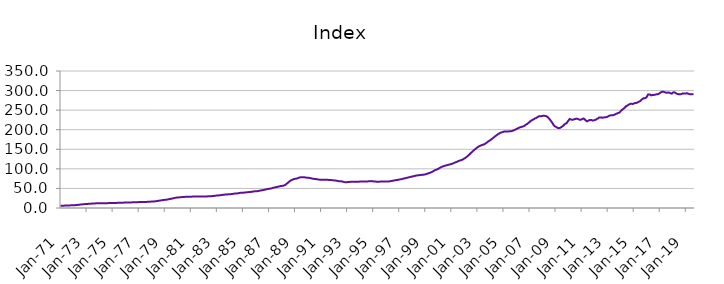
| Category | Index |
|---|---|
| 1971-01-01 | 5.879 |
| 1971-02-01 | 5.921 |
| 1971-03-01 | 5.963 |
| 1971-04-01 | 6.018 |
| 1971-05-01 | 6.108 |
| 1971-06-01 | 6.203 |
| 1971-07-01 | 6.32 |
| 1971-08-01 | 6.446 |
| 1971-09-01 | 6.572 |
| 1971-10-01 | 6.703 |
| 1971-11-01 | 6.844 |
| 1971-12-01 | 7.015 |
| 1972-01-01 | 7.135 |
| 1972-02-01 | 7.213 |
| 1972-03-01 | 7.39 |
| 1972-04-01 | 7.638 |
| 1972-05-01 | 7.997 |
| 1972-06-01 | 8.312 |
| 1972-07-01 | 8.674 |
| 1972-08-01 | 9.023 |
| 1972-09-01 | 9.332 |
| 1972-10-01 | 9.62 |
| 1972-11-01 | 9.887 |
| 1972-12-01 | 10.162 |
| 1973-01-01 | 10.359 |
| 1973-02-01 | 10.498 |
| 1973-03-01 | 10.658 |
| 1973-04-01 | 10.841 |
| 1973-05-01 | 11.075 |
| 1973-06-01 | 11.227 |
| 1973-07-01 | 11.386 |
| 1973-08-01 | 11.562 |
| 1973-09-01 | 11.768 |
| 1973-10-01 | 11.982 |
| 1973-11-01 | 12.145 |
| 1973-12-01 | 12.262 |
| 1974-01-01 | 12.324 |
| 1974-02-01 | 12.392 |
| 1974-03-01 | 12.389 |
| 1974-04-01 | 12.362 |
| 1974-05-01 | 12.339 |
| 1974-06-01 | 12.34 |
| 1974-07-01 | 12.352 |
| 1974-08-01 | 12.392 |
| 1974-09-01 | 12.465 |
| 1974-10-01 | 12.555 |
| 1974-11-01 | 12.63 |
| 1974-12-01 | 12.703 |
| 1975-01-01 | 12.737 |
| 1975-02-01 | 12.78 |
| 1975-03-01 | 12.857 |
| 1975-04-01 | 12.965 |
| 1975-05-01 | 13.097 |
| 1975-06-01 | 13.168 |
| 1975-07-01 | 13.237 |
| 1975-08-01 | 13.332 |
| 1975-09-01 | 13.462 |
| 1975-10-01 | 13.606 |
| 1975-11-01 | 13.732 |
| 1975-12-01 | 13.867 |
| 1976-01-01 | 13.963 |
| 1976-02-01 | 14.052 |
| 1976-03-01 | 14.114 |
| 1976-04-01 | 14.179 |
| 1976-05-01 | 14.264 |
| 1976-06-01 | 14.32 |
| 1976-07-01 | 14.382 |
| 1976-08-01 | 14.474 |
| 1976-09-01 | 14.605 |
| 1976-10-01 | 14.752 |
| 1976-11-01 | 14.87 |
| 1976-12-01 | 14.976 |
| 1977-01-01 | 15.034 |
| 1977-02-01 | 15.102 |
| 1977-03-01 | 15.145 |
| 1977-04-01 | 15.197 |
| 1977-05-01 | 15.276 |
| 1977-06-01 | 15.347 |
| 1977-07-01 | 15.436 |
| 1977-08-01 | 15.557 |
| 1977-09-01 | 15.705 |
| 1977-10-01 | 15.871 |
| 1977-11-01 | 16.048 |
| 1977-12-01 | 16.278 |
| 1978-01-01 | 16.449 |
| 1978-02-01 | 16.582 |
| 1978-03-01 | 16.762 |
| 1978-04-01 | 17.003 |
| 1978-05-01 | 17.391 |
| 1978-06-01 | 17.783 |
| 1978-07-01 | 18.258 |
| 1978-08-01 | 18.744 |
| 1978-09-01 | 19.213 |
| 1978-10-01 | 19.678 |
| 1978-11-01 | 20.113 |
| 1978-12-01 | 20.542 |
| 1979-01-01 | 20.797 |
| 1979-02-01 | 20.968 |
| 1979-03-01 | 21.394 |
| 1979-04-01 | 21.979 |
| 1979-05-01 | 22.725 |
| 1979-06-01 | 23.198 |
| 1979-07-01 | 23.69 |
| 1979-08-01 | 24.243 |
| 1979-09-01 | 24.906 |
| 1979-10-01 | 25.613 |
| 1979-11-01 | 26.202 |
| 1979-12-01 | 26.66 |
| 1980-01-01 | 26.911 |
| 1980-02-01 | 27.107 |
| 1980-03-01 | 27.357 |
| 1980-04-01 | 27.651 |
| 1980-05-01 | 27.994 |
| 1980-06-01 | 28.178 |
| 1980-07-01 | 28.344 |
| 1980-08-01 | 28.498 |
| 1980-09-01 | 28.607 |
| 1980-10-01 | 28.676 |
| 1980-11-01 | 28.73 |
| 1980-12-01 | 28.843 |
| 1981-01-01 | 28.911 |
| 1981-02-01 | 29.013 |
| 1981-03-01 | 29.116 |
| 1981-04-01 | 29.254 |
| 1981-05-01 | 29.394 |
| 1981-06-01 | 29.441 |
| 1981-07-01 | 29.464 |
| 1981-08-01 | 29.469 |
| 1981-09-01 | 29.414 |
| 1981-10-01 | 29.312 |
| 1981-11-01 | 29.219 |
| 1981-12-01 | 29.209 |
| 1982-01-01 | 29.164 |
| 1982-02-01 | 29.184 |
| 1982-03-01 | 29.346 |
| 1982-04-01 | 29.618 |
| 1982-05-01 | 29.924 |
| 1982-06-01 | 30.035 |
| 1982-07-01 | 30.119 |
| 1982-08-01 | 30.28 |
| 1982-09-01 | 30.54 |
| 1982-10-01 | 30.849 |
| 1982-11-01 | 31.157 |
| 1982-12-01 | 31.538 |
| 1983-01-01 | 31.828 |
| 1983-02-01 | 32.078 |
| 1983-03-01 | 32.337 |
| 1983-04-01 | 32.659 |
| 1983-05-01 | 33.081 |
| 1983-06-01 | 33.413 |
| 1983-07-01 | 33.773 |
| 1983-08-01 | 34.116 |
| 1983-09-01 | 34.39 |
| 1983-10-01 | 34.614 |
| 1983-11-01 | 34.826 |
| 1983-12-01 | 35.104 |
| 1984-01-01 | 35.27 |
| 1984-02-01 | 35.438 |
| 1984-03-01 | 35.758 |
| 1984-04-01 | 36.202 |
| 1984-05-01 | 36.71 |
| 1984-06-01 | 36.936 |
| 1984-07-01 | 37.124 |
| 1984-08-01 | 37.411 |
| 1984-09-01 | 37.87 |
| 1984-10-01 | 38.4 |
| 1984-11-01 | 38.81 |
| 1984-12-01 | 39.095 |
| 1985-01-01 | 39.174 |
| 1985-02-01 | 39.283 |
| 1985-03-01 | 39.552 |
| 1985-04-01 | 39.93 |
| 1985-05-01 | 40.361 |
| 1985-06-01 | 40.527 |
| 1985-07-01 | 40.681 |
| 1985-08-01 | 40.948 |
| 1985-09-01 | 41.393 |
| 1985-10-01 | 41.902 |
| 1985-11-01 | 42.329 |
| 1985-12-01 | 42.671 |
| 1986-01-01 | 42.803 |
| 1986-02-01 | 42.939 |
| 1986-03-01 | 43.335 |
| 1986-04-01 | 43.908 |
| 1986-05-01 | 44.624 |
| 1986-06-01 | 45.057 |
| 1986-07-01 | 45.499 |
| 1986-08-01 | 46.028 |
| 1986-09-01 | 46.692 |
| 1986-10-01 | 47.409 |
| 1986-11-01 | 48.06 |
| 1986-12-01 | 48.667 |
| 1987-01-01 | 49.02 |
| 1987-02-01 | 49.311 |
| 1987-03-01 | 49.944 |
| 1987-04-01 | 50.795 |
| 1987-05-01 | 51.813 |
| 1987-06-01 | 52.387 |
| 1987-07-01 | 52.937 |
| 1987-08-01 | 53.541 |
| 1987-09-01 | 54.197 |
| 1987-10-01 | 54.877 |
| 1987-11-01 | 55.513 |
| 1987-12-01 | 56.172 |
| 1988-01-01 | 56.486 |
| 1988-02-01 | 56.756 |
| 1988-03-01 | 57.701 |
| 1988-04-01 | 59.124 |
| 1988-05-01 | 61.264 |
| 1988-06-01 | 63.424 |
| 1988-07-01 | 65.968 |
| 1988-08-01 | 68.307 |
| 1988-09-01 | 70.109 |
| 1988-10-01 | 71.604 |
| 1988-11-01 | 72.807 |
| 1988-12-01 | 73.875 |
| 1989-01-01 | 74.434 |
| 1989-02-01 | 74.906 |
| 1989-03-01 | 75.707 |
| 1989-04-01 | 76.727 |
| 1989-05-01 | 77.807 |
| 1989-06-01 | 78.279 |
| 1989-07-01 | 78.601 |
| 1989-08-01 | 78.752 |
| 1989-09-01 | 78.622 |
| 1989-10-01 | 78.258 |
| 1989-11-01 | 77.774 |
| 1989-12-01 | 77.38 |
| 1990-01-01 | 77.025 |
| 1990-02-01 | 77.011 |
| 1990-03-01 | 76.482 |
| 1990-04-01 | 75.796 |
| 1990-05-01 | 74.994 |
| 1990-06-01 | 74.611 |
| 1990-07-01 | 74.285 |
| 1990-08-01 | 73.967 |
| 1990-09-01 | 73.52 |
| 1990-10-01 | 73.009 |
| 1990-11-01 | 72.535 |
| 1990-12-01 | 72.334 |
| 1991-01-01 | 72.192 |
| 1991-02-01 | 72.268 |
| 1991-03-01 | 72.153 |
| 1991-04-01 | 72.077 |
| 1991-05-01 | 71.977 |
| 1991-06-01 | 71.933 |
| 1991-07-01 | 71.885 |
| 1991-08-01 | 71.819 |
| 1991-09-01 | 71.705 |
| 1991-10-01 | 71.501 |
| 1991-11-01 | 71.166 |
| 1991-12-01 | 70.813 |
| 1992-01-01 | 70.463 |
| 1992-02-01 | 70.409 |
| 1992-03-01 | 69.918 |
| 1992-04-01 | 69.325 |
| 1992-05-01 | 68.671 |
| 1992-06-01 | 68.457 |
| 1992-07-01 | 68.303 |
| 1992-08-01 | 67.98 |
| 1992-09-01 | 67.29 |
| 1992-10-01 | 66.434 |
| 1992-11-01 | 65.854 |
| 1992-12-01 | 65.871 |
| 1993-01-01 | 66.034 |
| 1993-02-01 | 66.322 |
| 1993-03-01 | 66.581 |
| 1993-04-01 | 66.905 |
| 1993-05-01 | 67.182 |
| 1993-06-01 | 67.213 |
| 1993-07-01 | 67.233 |
| 1993-08-01 | 67.289 |
| 1993-09-01 | 67.247 |
| 1993-10-01 | 67.126 |
| 1993-11-01 | 67.046 |
| 1993-12-01 | 67.281 |
| 1994-01-01 | 67.604 |
| 1994-02-01 | 68.006 |
| 1994-03-01 | 67.991 |
| 1994-04-01 | 67.827 |
| 1994-05-01 | 67.683 |
| 1994-06-01 | 67.696 |
| 1994-07-01 | 67.777 |
| 1994-08-01 | 67.944 |
| 1994-09-01 | 68.21 |
| 1994-10-01 | 68.532 |
| 1994-11-01 | 68.685 |
| 1994-12-01 | 68.595 |
| 1995-01-01 | 68.092 |
| 1995-02-01 | 67.66 |
| 1995-03-01 | 67.497 |
| 1995-04-01 | 67.327 |
| 1995-05-01 | 67.356 |
| 1995-06-01 | 67.213 |
| 1995-07-01 | 67.36 |
| 1995-08-01 | 67.425 |
| 1995-09-01 | 67.463 |
| 1995-10-01 | 67.439 |
| 1995-11-01 | 67.524 |
| 1995-12-01 | 67.607 |
| 1996-01-01 | 67.632 |
| 1996-02-01 | 67.59 |
| 1996-03-01 | 67.814 |
| 1996-04-01 | 68.077 |
| 1996-05-01 | 68.578 |
| 1996-06-01 | 68.945 |
| 1996-07-01 | 69.543 |
| 1996-08-01 | 70.122 |
| 1996-09-01 | 70.708 |
| 1996-10-01 | 71.134 |
| 1996-11-01 | 71.585 |
| 1996-12-01 | 72.224 |
| 1997-01-01 | 72.682 |
| 1997-02-01 | 73.17 |
| 1997-03-01 | 73.587 |
| 1997-04-01 | 74.264 |
| 1997-05-01 | 75.148 |
| 1997-06-01 | 75.819 |
| 1997-07-01 | 76.292 |
| 1997-08-01 | 77.048 |
| 1997-09-01 | 77.723 |
| 1997-10-01 | 78.598 |
| 1997-11-01 | 79.21 |
| 1997-12-01 | 79.988 |
| 1998-01-01 | 80.449 |
| 1998-02-01 | 81.141 |
| 1998-03-01 | 81.745 |
| 1998-04-01 | 82.495 |
| 1998-05-01 | 83.027 |
| 1998-06-01 | 83.355 |
| 1998-07-01 | 83.747 |
| 1998-08-01 | 84.113 |
| 1998-09-01 | 84.484 |
| 1998-10-01 | 84.731 |
| 1998-11-01 | 85.018 |
| 1998-12-01 | 85.363 |
| 1999-01-01 | 85.875 |
| 1999-02-01 | 86.896 |
| 1999-03-01 | 87.796 |
| 1999-04-01 | 88.688 |
| 1999-05-01 | 89.666 |
| 1999-06-01 | 90.701 |
| 1999-07-01 | 91.918 |
| 1999-08-01 | 93.495 |
| 1999-09-01 | 95.101 |
| 1999-10-01 | 96.577 |
| 1999-11-01 | 97.58 |
| 1999-12-01 | 98.926 |
| 2000-01-01 | 100 |
| 2000-02-01 | 101.936 |
| 2000-03-01 | 103.455 |
| 2000-04-01 | 105.075 |
| 2000-05-01 | 105.895 |
| 2000-06-01 | 106.901 |
| 2000-07-01 | 107.798 |
| 2000-08-01 | 108.633 |
| 2000-09-01 | 109.409 |
| 2000-10-01 | 110.207 |
| 2000-11-01 | 110.863 |
| 2000-12-01 | 111.699 |
| 2001-01-01 | 112.376 |
| 2001-02-01 | 113.427 |
| 2001-03-01 | 114.41 |
| 2001-04-01 | 115.617 |
| 2001-05-01 | 116.92 |
| 2001-06-01 | 118 |
| 2001-07-01 | 119.178 |
| 2001-08-01 | 120.352 |
| 2001-09-01 | 121.415 |
| 2001-10-01 | 122.129 |
| 2001-11-01 | 123.346 |
| 2001-12-01 | 124.695 |
| 2002-01-01 | 126.498 |
| 2002-02-01 | 128.249 |
| 2002-03-01 | 130.341 |
| 2002-04-01 | 132.594 |
| 2002-05-01 | 135.137 |
| 2002-06-01 | 137.714 |
| 2002-07-01 | 140.534 |
| 2002-08-01 | 143.04 |
| 2002-09-01 | 145.7 |
| 2002-10-01 | 148.191 |
| 2002-11-01 | 150.379 |
| 2002-12-01 | 152.788 |
| 2003-01-01 | 154.938 |
| 2003-02-01 | 156.702 |
| 2003-03-01 | 158.127 |
| 2003-04-01 | 159.492 |
| 2003-05-01 | 160.649 |
| 2003-06-01 | 161.58 |
| 2003-07-01 | 162.401 |
| 2003-08-01 | 164.014 |
| 2003-09-01 | 165.699 |
| 2003-10-01 | 167.901 |
| 2003-11-01 | 170.039 |
| 2003-12-01 | 171.829 |
| 2004-01-01 | 173.609 |
| 2004-02-01 | 175.589 |
| 2004-03-01 | 177.991 |
| 2004-04-01 | 180.138 |
| 2004-05-01 | 182.465 |
| 2004-06-01 | 184.54 |
| 2004-07-01 | 186.551 |
| 2004-08-01 | 188.625 |
| 2004-09-01 | 190.257 |
| 2004-10-01 | 192.019 |
| 2004-11-01 | 192.962 |
| 2004-12-01 | 193.904 |
| 2005-01-01 | 194.627 |
| 2005-02-01 | 195.72 |
| 2005-03-01 | 195.655 |
| 2005-04-01 | 195.754 |
| 2005-05-01 | 195.194 |
| 2005-06-01 | 195.793 |
| 2005-07-01 | 195.867 |
| 2005-08-01 | 196.175 |
| 2005-09-01 | 196.736 |
| 2005-10-01 | 197.938 |
| 2005-11-01 | 198.884 |
| 2005-12-01 | 200.645 |
| 2006-01-01 | 201.661 |
| 2006-02-01 | 203.374 |
| 2006-03-01 | 204.511 |
| 2006-04-01 | 205.861 |
| 2006-05-01 | 206.826 |
| 2006-06-01 | 207.511 |
| 2006-07-01 | 208.388 |
| 2006-08-01 | 209.567 |
| 2006-09-01 | 211.353 |
| 2006-10-01 | 213.443 |
| 2006-11-01 | 215.14 |
| 2006-12-01 | 217.475 |
| 2007-01-01 | 219.496 |
| 2007-02-01 | 222.231 |
| 2007-03-01 | 223.7 |
| 2007-04-01 | 225.58 |
| 2007-05-01 | 226.869 |
| 2007-06-01 | 228.812 |
| 2007-07-01 | 229.701 |
| 2007-08-01 | 231.63 |
| 2007-09-01 | 233.384 |
| 2007-10-01 | 234.664 |
| 2007-11-01 | 234.312 |
| 2007-12-01 | 234.555 |
| 2008-01-01 | 235.086 |
| 2008-02-01 | 236.026 |
| 2008-03-01 | 235.364 |
| 2008-04-01 | 234.965 |
| 2008-05-01 | 233.6 |
| 2008-06-01 | 231.702 |
| 2008-07-01 | 228.29 |
| 2008-08-01 | 225.152 |
| 2008-09-01 | 221.485 |
| 2008-10-01 | 217.485 |
| 2008-11-01 | 212.758 |
| 2008-12-01 | 209.323 |
| 2009-01-01 | 207.652 |
| 2009-02-01 | 206.212 |
| 2009-03-01 | 204.576 |
| 2009-04-01 | 203.86 |
| 2009-05-01 | 204.572 |
| 2009-06-01 | 206.247 |
| 2009-07-01 | 207.906 |
| 2009-08-01 | 210.209 |
| 2009-09-01 | 213.072 |
| 2009-10-01 | 215.548 |
| 2009-11-01 | 216.169 |
| 2009-12-01 | 220.435 |
| 2010-01-01 | 223.882 |
| 2010-02-01 | 227.544 |
| 2010-03-01 | 226.207 |
| 2010-04-01 | 225.371 |
| 2010-05-01 | 225.616 |
| 2010-06-01 | 226.496 |
| 2010-07-01 | 227.242 |
| 2010-08-01 | 228.031 |
| 2010-09-01 | 227.934 |
| 2010-10-01 | 227.086 |
| 2010-11-01 | 225.565 |
| 2010-12-01 | 225.597 |
| 2011-01-01 | 226.214 |
| 2011-02-01 | 228.039 |
| 2011-03-01 | 228.503 |
| 2011-04-01 | 226.162 |
| 2011-05-01 | 223.102 |
| 2011-06-01 | 221.419 |
| 2011-07-01 | 222.781 |
| 2011-08-01 | 224.513 |
| 2011-09-01 | 224.472 |
| 2011-10-01 | 224.841 |
| 2011-11-01 | 223.579 |
| 2011-12-01 | 223.822 |
| 2012-01-01 | 224.584 |
| 2012-02-01 | 225.473 |
| 2012-03-01 | 227.466 |
| 2012-04-01 | 228.575 |
| 2012-05-01 | 231.11 |
| 2012-06-01 | 231.251 |
| 2012-07-01 | 231.282 |
| 2012-08-01 | 230.612 |
| 2012-09-01 | 231.126 |
| 2012-10-01 | 231.503 |
| 2012-11-01 | 231.747 |
| 2012-12-01 | 232.346 |
| 2013-01-01 | 233.26 |
| 2013-02-01 | 235.199 |
| 2013-03-01 | 236.287 |
| 2013-04-01 | 236.897 |
| 2013-05-01 | 236.822 |
| 2013-06-01 | 237.016 |
| 2013-07-01 | 237.888 |
| 2013-08-01 | 239.493 |
| 2013-09-01 | 240.786 |
| 2013-10-01 | 242.115 |
| 2013-11-01 | 242.898 |
| 2013-12-01 | 244.057 |
| 2014-01-01 | 247.816 |
| 2014-02-01 | 250.169 |
| 2014-03-01 | 252.769 |
| 2014-04-01 | 254.326 |
| 2014-05-01 | 257.246 |
| 2014-06-01 | 260.069 |
| 2014-07-01 | 261.53 |
| 2014-08-01 | 263.472 |
| 2014-09-01 | 264.905 |
| 2014-10-01 | 266.07 |
| 2014-11-01 | 266.347 |
| 2014-12-01 | 265.659 |
| 2015-01-01 | 266.928 |
| 2015-02-01 | 267.88 |
| 2015-03-01 | 268.307 |
| 2015-04-01 | 269.155 |
| 2015-05-01 | 270.34 |
| 2015-06-01 | 272.163 |
| 2015-07-01 | 273.277 |
| 2015-08-01 | 276.288 |
| 2015-09-01 | 278.116 |
| 2015-10-01 | 280.486 |
| 2015-11-01 | 280.294 |
| 2015-12-01 | 281.199 |
| 2016-01-01 | 283.607 |
| 2016-02-01 | 289.619 |
| 2016-03-01 | 290.057 |
| 2016-04-01 | 289.886 |
| 2016-05-01 | 287.681 |
| 2016-06-01 | 288.483 |
| 2016-07-01 | 288.661 |
| 2016-08-01 | 289.259 |
| 2016-09-01 | 289.711 |
| 2016-10-01 | 290.701 |
| 2016-11-01 | 290.463 |
| 2016-12-01 | 291.375 |
| 2017-01-01 | 293.717 |
| 2017-02-01 | 295.456 |
| 2017-03-01 | 297.078 |
| 2017-04-01 | 296.912 |
| 2017-05-01 | 296.553 |
| 2017-06-01 | 295.078 |
| 2017-07-01 | 294.677 |
| 2017-08-01 | 294.669 |
| 2017-09-01 | 295.305 |
| 2017-10-01 | 294.345 |
| 2017-11-01 | 293.162 |
| 2017-12-01 | 292.069 |
| 2018-01-01 | 294.449 |
| 2018-02-01 | 295.846 |
| 2018-03-01 | 294.92 |
| 2018-04-01 | 292.924 |
| 2018-05-01 | 291.472 |
| 2018-06-01 | 291.002 |
| 2018-07-01 | 290.236 |
| 2018-08-01 | 290.758 |
| 2018-09-01 | 291.058 |
| 2018-10-01 | 292.824 |
| 2018-11-01 | 292.65 |
| 2018-12-01 | 292.367 |
| 2019-01-01 | 292.269 |
| 2019-02-01 | 293.425 |
| 2019-03-01 | 292.124 |
| 2019-04-01 | 291.038 |
| 2019-05-01 | 290.728 |
| 2019-06-01 | 290.722 |
| 2019-07-01 | 290.784 |
| 2019-08-01 | 290.505 |